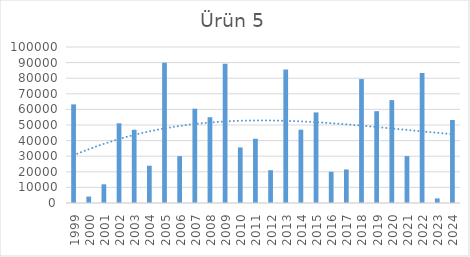
| Category | Ürün 5 |
|---|---|
| 1999.0 | 63215 |
| 2000.0 | 4127 |
| 2001.0 | 11990 |
| 2002.0 | 51098 |
| 2003.0 | 46941 |
| 2004.0 | 23904 |
| 2005.0 | 89978 |
| 2006.0 | 30066 |
| 2007.0 | 60468 |
| 2008.0 | 54994 |
| 2009.0 | 89289 |
| 2010.0 | 35637 |
| 2011.0 | 41211 |
| 2012.0 | 21018 |
| 2013.0 | 85583 |
| 2014.0 | 47005 |
| 2015.0 | 58073 |
| 2016.0 | 20010 |
| 2017.0 | 21517 |
| 2018.0 | 79442 |
| 2019.0 | 58868 |
| 2020.0 | 65947 |
| 2021.0 | 30072 |
| 2022.0 | 83296 |
| 2023.0 | 2948 |
| 2024.0 | 53225 |